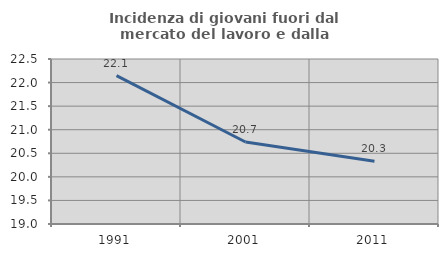
| Category | Incidenza di giovani fuori dal mercato del lavoro e dalla formazione  |
|---|---|
| 1991.0 | 22.146 |
| 2001.0 | 20.74 |
| 2011.0 | 20.329 |